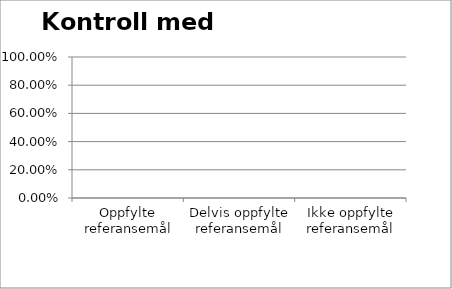
| Category | Kontroll med miljø |
|---|---|
| Oppfylte referansemål | 0 |
| Delvis oppfylte referansemål | 0 |
| Ikke oppfylte referansemål | 0 |